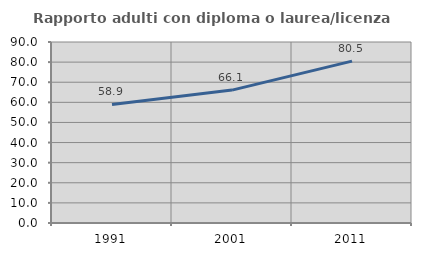
| Category | Rapporto adulti con diploma o laurea/licenza media  |
|---|---|
| 1991.0 | 58.94 |
| 2001.0 | 66.087 |
| 2011.0 | 80.488 |